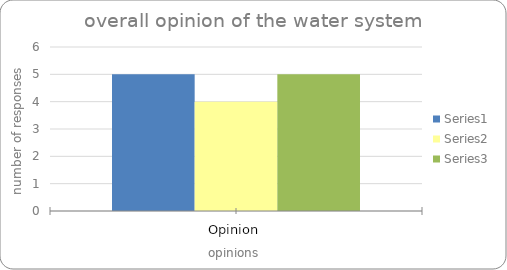
| Category | Series 0 | Series 1 | Series 2 |
|---|---|---|---|
| Opinion | 5 | 4 | 5 |